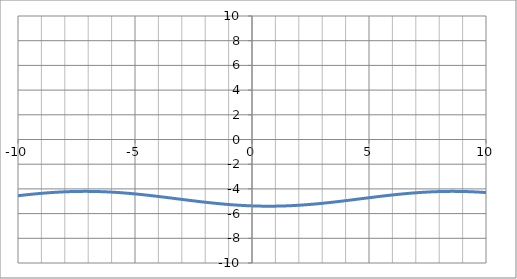
| Category | f(x) |
|---|---|
| -10.0 | -4.553 |
| -9.9 | -4.531 |
| -9.8 | -4.51 |
| -9.700000000000001 | -4.489 |
| -9.600000000000001 | -4.469 |
| -9.500000000000002 | -4.449 |
| -9.400000000000002 | -4.43 |
| -9.300000000000002 | -4.411 |
| -9.200000000000003 | -4.393 |
| -9.100000000000003 | -4.376 |
| -9.000000000000004 | -4.359 |
| -8.900000000000004 | -4.343 |
| -8.800000000000004 | -4.328 |
| -8.700000000000005 | -4.314 |
| -8.600000000000005 | -4.3 |
| -8.500000000000005 | -4.287 |
| -8.400000000000006 | -4.275 |
| -8.300000000000006 | -4.264 |
| -8.200000000000006 | -4.254 |
| -8.100000000000007 | -4.244 |
| -8.000000000000007 | -4.236 |
| -7.9000000000000075 | -4.228 |
| -7.800000000000008 | -4.221 |
| -7.700000000000008 | -4.215 |
| -7.6000000000000085 | -4.21 |
| -7.500000000000009 | -4.206 |
| -7.400000000000009 | -4.203 |
| -7.30000000000001 | -4.201 |
| -7.20000000000001 | -4.2 |
| -7.10000000000001 | -4.2 |
| -7.000000000000011 | -4.201 |
| -6.900000000000011 | -4.203 |
| -6.800000000000011 | -4.205 |
| -6.700000000000012 | -4.209 |
| -6.600000000000012 | -4.214 |
| -6.500000000000012 | -4.219 |
| -6.400000000000013 | -4.226 |
| -6.300000000000013 | -4.233 |
| -6.2000000000000135 | -4.241 |
| -6.100000000000014 | -4.251 |
| -6.000000000000014 | -4.261 |
| -5.900000000000015 | -4.272 |
| -5.800000000000015 | -4.284 |
| -5.700000000000015 | -4.296 |
| -5.600000000000016 | -4.31 |
| -5.500000000000016 | -4.324 |
| -5.400000000000016 | -4.339 |
| -5.300000000000017 | -4.354 |
| -5.200000000000017 | -4.371 |
| -5.100000000000017 | -4.388 |
| -5.000000000000018 | -4.406 |
| -4.900000000000018 | -4.424 |
| -4.8000000000000185 | -4.443 |
| -4.700000000000019 | -4.463 |
| -4.600000000000019 | -4.483 |
| -4.5000000000000195 | -4.504 |
| -4.40000000000002 | -4.525 |
| -4.30000000000002 | -4.546 |
| -4.200000000000021 | -4.568 |
| -4.100000000000021 | -4.59 |
| -4.000000000000021 | -4.613 |
| -3.9000000000000212 | -4.636 |
| -3.800000000000021 | -4.659 |
| -3.700000000000021 | -4.683 |
| -3.600000000000021 | -4.706 |
| -3.500000000000021 | -4.73 |
| -3.400000000000021 | -4.754 |
| -3.3000000000000207 | -4.778 |
| -3.2000000000000206 | -4.802 |
| -3.1000000000000205 | -4.826 |
| -3.0000000000000204 | -4.85 |
| -2.9000000000000203 | -4.874 |
| -2.8000000000000203 | -4.897 |
| -2.70000000000002 | -4.921 |
| -2.60000000000002 | -4.944 |
| -2.50000000000002 | -4.968 |
| -2.40000000000002 | -4.991 |
| -2.30000000000002 | -5.013 |
| -2.2000000000000197 | -5.035 |
| -2.1000000000000196 | -5.057 |
| -2.0000000000000195 | -5.079 |
| -1.9000000000000195 | -5.1 |
| -1.8000000000000194 | -5.12 |
| -1.7000000000000193 | -5.14 |
| -1.6000000000000192 | -5.16 |
| -1.500000000000019 | -5.179 |
| -1.400000000000019 | -5.197 |
| -1.300000000000019 | -5.215 |
| -1.2000000000000188 | -5.232 |
| -1.1000000000000187 | -5.248 |
| -1.0000000000000187 | -5.264 |
| -0.9000000000000187 | -5.279 |
| -0.8000000000000187 | -5.293 |
| -0.7000000000000187 | -5.306 |
| -0.6000000000000187 | -5.318 |
| -0.5000000000000188 | -5.33 |
| -0.4000000000000188 | -5.341 |
| -0.3000000000000188 | -5.351 |
| -0.2000000000000188 | -5.36 |
| -0.1000000000000188 | -5.368 |
| -1.8790524691780774e-14 | -5.375 |
| 0.09999999999998122 | -5.382 |
| 0.19999999999998122 | -5.387 |
| 0.2999999999999812 | -5.392 |
| 0.39999999999998126 | -5.395 |
| 0.49999999999998124 | -5.398 |
| 0.5999999999999812 | -5.399 |
| 0.6999999999999812 | -5.4 |
| 0.7999999999999812 | -5.4 |
| 0.8999999999999811 | -5.398 |
| 0.9999999999999811 | -5.396 |
| 1.0999999999999812 | -5.393 |
| 1.1999999999999813 | -5.389 |
| 1.2999999999999814 | -5.384 |
| 1.3999999999999815 | -5.378 |
| 1.4999999999999816 | -5.371 |
| 1.5999999999999817 | -5.363 |
| 1.6999999999999817 | -5.354 |
| 1.7999999999999818 | -5.345 |
| 1.899999999999982 | -5.334 |
| 1.999999999999982 | -5.323 |
| 2.099999999999982 | -5.311 |
| 2.199999999999982 | -5.298 |
| 2.299999999999982 | -5.284 |
| 2.399999999999982 | -5.269 |
| 2.4999999999999822 | -5.254 |
| 2.5999999999999823 | -5.238 |
| 2.6999999999999824 | -5.221 |
| 2.7999999999999825 | -5.204 |
| 2.8999999999999826 | -5.186 |
| 2.9999999999999827 | -5.167 |
| 3.0999999999999828 | -5.148 |
| 3.199999999999983 | -5.128 |
| 3.299999999999983 | -5.108 |
| 3.399999999999983 | -5.087 |
| 3.499999999999983 | -5.066 |
| 3.599999999999983 | -5.044 |
| 3.6999999999999833 | -5.022 |
| 3.7999999999999834 | -4.999 |
| 3.8999999999999835 | -4.976 |
| 3.9999999999999836 | -4.953 |
| 4.099999999999984 | -4.93 |
| 4.199999999999983 | -4.906 |
| 4.299999999999983 | -4.883 |
| 4.399999999999983 | -4.859 |
| 4.499999999999982 | -4.835 |
| 4.599999999999982 | -4.811 |
| 4.6999999999999815 | -4.787 |
| 4.799999999999981 | -4.763 |
| 4.899999999999981 | -4.739 |
| 4.9999999999999805 | -4.715 |
| 5.09999999999998 | -4.692 |
| 5.19999999999998 | -4.668 |
| 5.299999999999979 | -4.645 |
| 5.399999999999979 | -4.622 |
| 5.499999999999979 | -4.599 |
| 5.599999999999978 | -4.577 |
| 5.699999999999978 | -4.554 |
| 5.799999999999978 | -4.533 |
| 5.899999999999977 | -4.512 |
| 5.999999999999977 | -4.491 |
| 6.0999999999999766 | -4.47 |
| 6.199999999999976 | -4.451 |
| 6.299999999999976 | -4.431 |
| 6.3999999999999755 | -4.413 |
| 6.499999999999975 | -4.395 |
| 6.599999999999975 | -4.377 |
| 6.699999999999974 | -4.361 |
| 6.799999999999974 | -4.345 |
| 6.899999999999974 | -4.329 |
| 6.999999999999973 | -4.315 |
| 7.099999999999973 | -4.301 |
| 7.199999999999973 | -4.288 |
| 7.299999999999972 | -4.276 |
| 7.399999999999972 | -4.265 |
| 7.499999999999972 | -4.254 |
| 7.599999999999971 | -4.245 |
| 7.699999999999971 | -4.236 |
| 7.7999999999999705 | -4.228 |
| 7.89999999999997 | -4.222 |
| 7.99999999999997 | -4.216 |
| 8.09999999999997 | -4.211 |
| 8.199999999999969 | -4.207 |
| 8.299999999999969 | -4.204 |
| 8.399999999999968 | -4.201 |
| 8.499999999999968 | -4.2 |
| 8.599999999999968 | -4.2 |
| 8.699999999999967 | -4.201 |
| 8.799999999999967 | -4.202 |
| 8.899999999999967 | -4.205 |
| 8.999999999999966 | -4.209 |
| 9.099999999999966 | -4.213 |
| 9.199999999999966 | -4.219 |
| 9.299999999999965 | -4.225 |
| 9.399999999999965 | -4.233 |
| 9.499999999999964 | -4.241 |
| 9.599999999999964 | -4.25 |
| 9.699999999999964 | -4.26 |
| 9.799999999999963 | -4.271 |
| 9.899999999999963 | -4.283 |
| 9.999999999999963 | -4.295 |